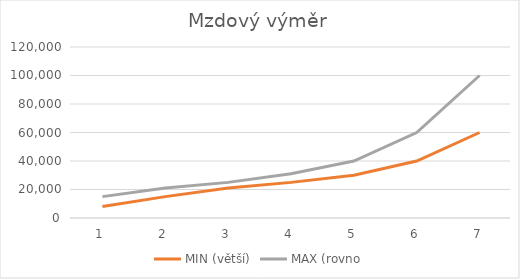
| Category | MIN (větší) | MAX (rovno |
|---|---|---|
| 0 | 8000 | 15000 |
| 1 | 15000 | 21000 |
| 2 | 21000 | 25000 |
| 3 | 25000 | 31000 |
| 4 | 30000 | 40000 |
| 5 | 40000 | 60000 |
| 6 | 60000 | 100000 |